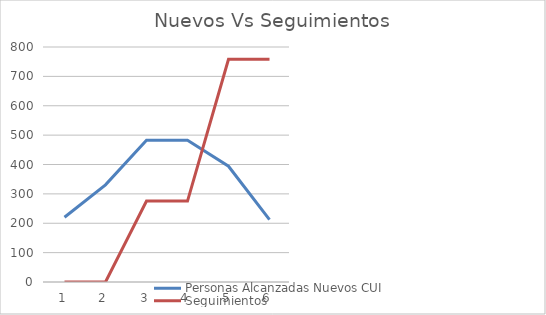
| Category | Personas Alcanzadas Nuevos CUI | Seguimientos |
|---|---|---|
| 0 | 220.48 | 0 |
| 1 | 330.72 | 0 |
| 2 | 482.3 | 275.6 |
| 3 | 482.3 | 275.6 |
| 4 | 394.108 | 757.9 |
| 5 | 212.212 | 757.9 |